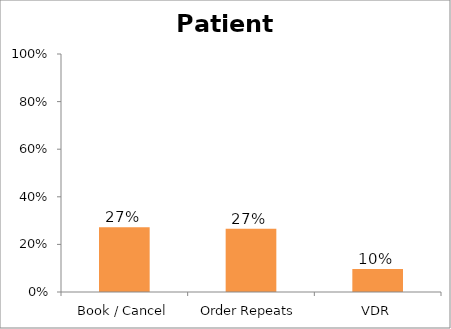
| Category | 27 BEAUMONT STREET |
|---|---|
| Book / Cancel | 0.272 |
| Order Repeats | 0.266 |
| VDR | 0.097 |